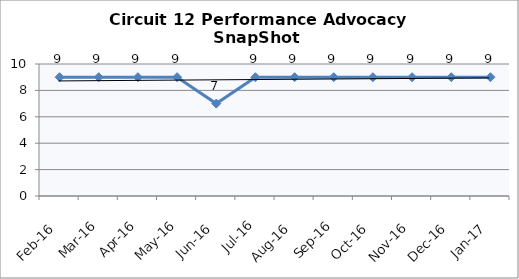
| Category | Circuit 12 |
|---|---|
| Feb-16 | 9 |
| Mar-16 | 9 |
| Apr-16 | 9 |
| May-16 | 9 |
| Jun-16 | 7 |
| Jul-16 | 9 |
| Aug-16 | 9 |
| Sep-16 | 9 |
| Oct-16 | 9 |
| Nov-16 | 9 |
| Dec-16 | 9 |
| Jan-17 | 9 |